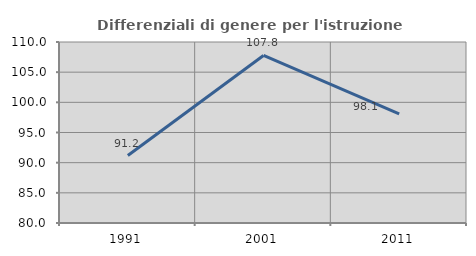
| Category | Differenziali di genere per l'istruzione superiore |
|---|---|
| 1991.0 | 91.182 |
| 2001.0 | 107.775 |
| 2011.0 | 98.073 |